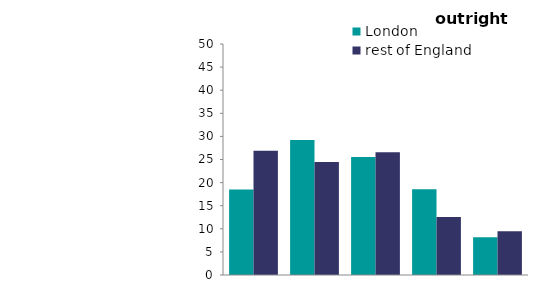
| Category | London | rest of England |
|---|---|---|
| first quintile (lowest) | 18.485 | 26.908 |
| second quintile | 29.228 | 24.459 |
| third quintile | 25.549 | 26.568 |
| fourth quintile | 18.546 | 12.57 |
| fifth quintile (highest) | 8.192 | 9.496 |